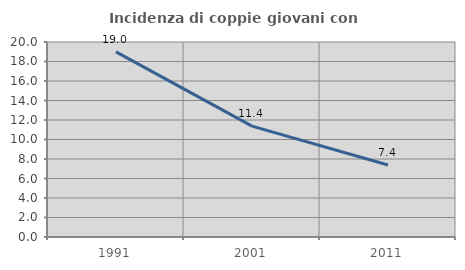
| Category | Incidenza di coppie giovani con figli |
|---|---|
| 1991.0 | 18.993 |
| 2001.0 | 11.369 |
| 2011.0 | 7.379 |